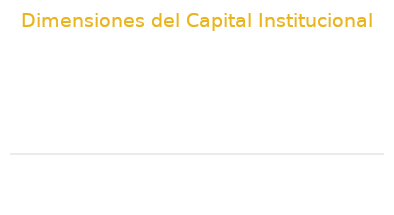
| Category | Total |
|---|---|
| Promedio de Índice de Desarrollo Municipal | 3.141 |
| Promedio de Planificación | 6.667 |
| Promedio de Instituciones Nacionales | 1.19 |